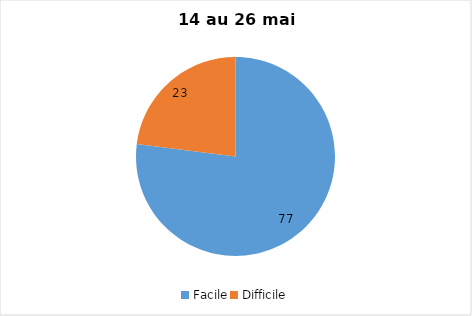
| Category | Series 0 |
|---|---|
| Facile | 77 |
| Difficile | 23 |